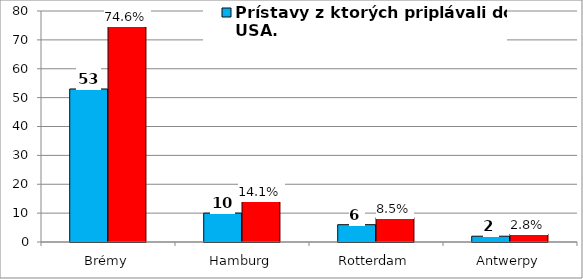
| Category | Prístavy z ktorých priplávali do USA. | Series 1 |
|---|---|---|
| Brémy | 53 | 74.648 |
| Hamburg | 10 | 14.085 |
| Rotterdam | 6 | 8.451 |
| Antwerpy | 2 | 2.817 |